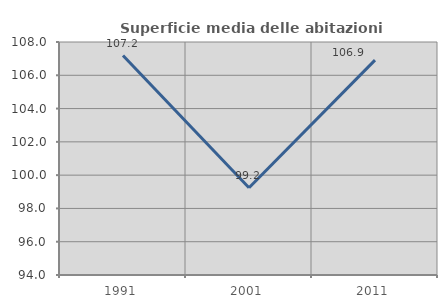
| Category | Superficie media delle abitazioni occupate |
|---|---|
| 1991.0 | 107.188 |
| 2001.0 | 99.243 |
| 2011.0 | 106.91 |